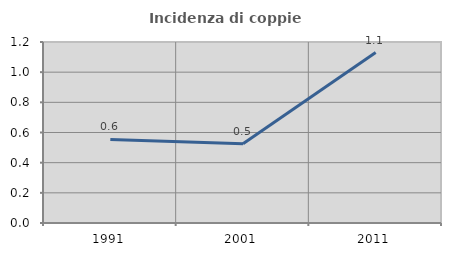
| Category | Incidenza di coppie miste |
|---|---|
| 1991.0 | 0.554 |
| 2001.0 | 0.525 |
| 2011.0 | 1.13 |